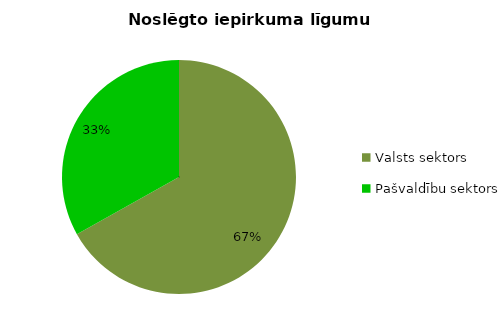
| Category | Noslēgto iepirkuma līgumu skaits |
|---|---|
| Valsts sektors | 8485 |
| Pašvaldību sektors | 4202 |